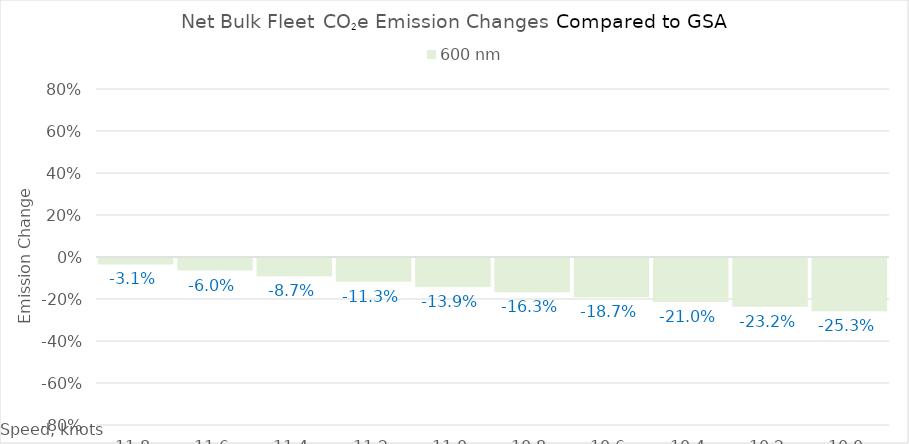
| Category | 600 |
|---|---|
| 11.8 | -0.031 |
| 11.600000000000001 | -0.06 |
| 11.400000000000002 | -0.087 |
| 11.200000000000003 | -0.113 |
| 11.000000000000004 | -0.139 |
| 10.800000000000004 | -0.163 |
| 10.600000000000005 | -0.187 |
| 10.400000000000006 | -0.21 |
| 10.200000000000006 | -0.232 |
| 10.000000000000007 | -0.253 |